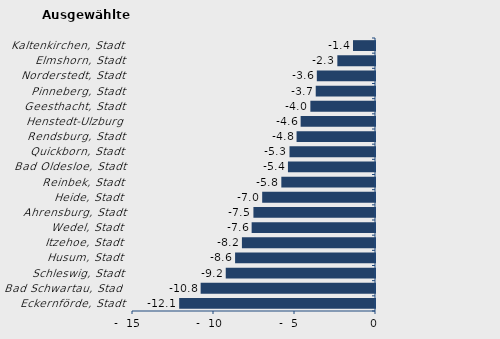
| Category | Überschuss der Geborenen (+) bzw. Gestorbenen (-) |
|---|---|
| Eckernförde, Stadt | -12.089 |
| Bad Schwartau, Stadt | -10.763 |
| Schleswig, Stadt | -9.213 |
| Husum, Stadt | -8.637 |
| Itzehoe, Stadt | -8.215 |
| Wedel, Stadt | -7.615 |
| Ahrensburg, Stadt | -7.505 |
| Heide, Stadt | -6.964 |
| Reinbek, Stadt | -5.782 |
| Bad Oldesloe, Stadt | -5.374 |
| Quickborn, Stadt | -5.279 |
| Rendsburg, Stadt | -4.841 |
| Henstedt-Ulzburg | -4.59 |
| Geesthacht, Stadt | -3.989 |
| Pinneberg, Stadt | -3.659 |
| Norderstedt, Stadt | -3.591 |
| Elmshorn, Stadt | -2.324 |
| Kaltenkirchen, Stadt | -1.36 |